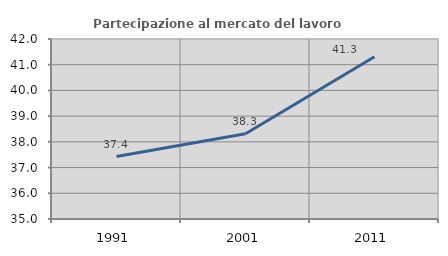
| Category | Partecipazione al mercato del lavoro  femminile |
|---|---|
| 1991.0 | 37.428 |
| 2001.0 | 38.315 |
| 2011.0 | 41.312 |